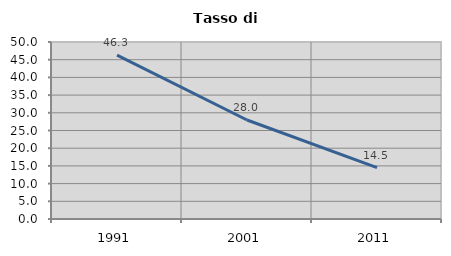
| Category | Tasso di disoccupazione   |
|---|---|
| 1991.0 | 46.303 |
| 2001.0 | 27.962 |
| 2011.0 | 14.495 |